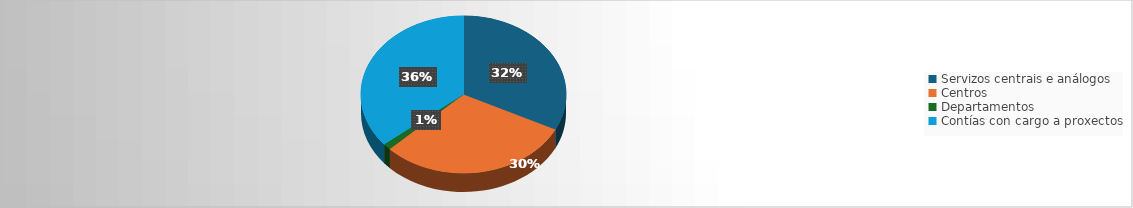
| Category | Series 0 |
|---|---|
| Servizos centrais e análogos | 36939.81 |
| Centros | 34666.83 |
| Departamentos | 1445.77 |
| Contías con cargo a proxectos | 41057.95 |